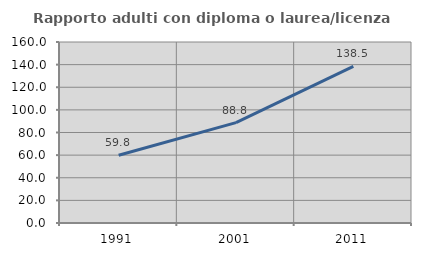
| Category | Rapporto adulti con diploma o laurea/licenza media  |
|---|---|
| 1991.0 | 59.838 |
| 2001.0 | 88.762 |
| 2011.0 | 138.521 |